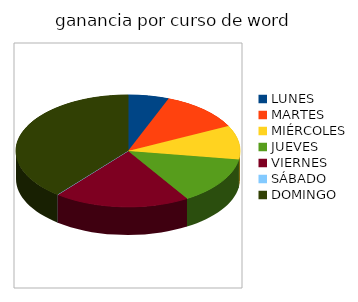
| Category | WORD |
|---|---|
| LUNES | 120000 |
| MARTES | 240000 |
| MIÉRCOLES | 200000 |
| JUEVES | 280000 |
| VIERNES | 400000 |
| SÁBADO | 0 |
| DOMINGO | 800000 |